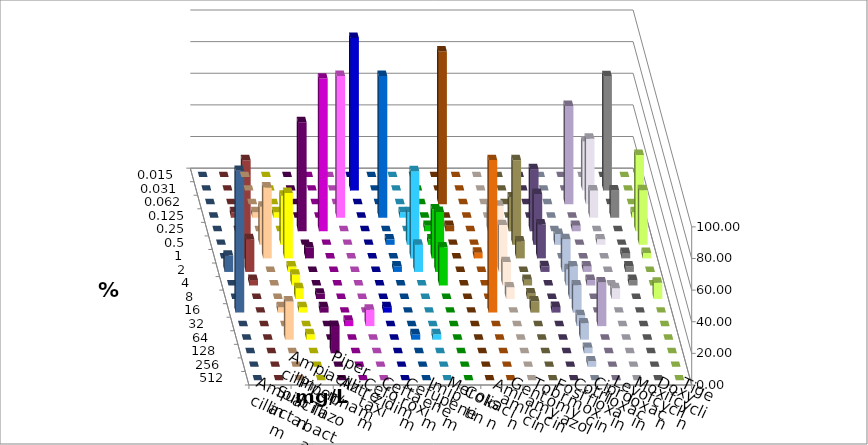
| Category | Ampicillin | Ampicillin/ Sulbactam | Piperacillin | Piperacillin/ Tazobactam | Aztreonam | Cefotaxim | Ceftazidim | Cefuroxim | Imipenem | Meropenem | Colistin | Amikacin | Gentamicin | Tobramycin | Fosfomycin | Cotrimoxazol | Ciprofloxacin | Levofloxacin | Moxifloxacin | Doxycyclin | Tigecyclin |
|---|---|---|---|---|---|---|---|---|---|---|---|---|---|---|---|---|---|---|---|---|---|
| 0.015 | 0 | 0 | 0 | 0 | 0 | 0 | 0 | 0 | 0 | 0 | 0 | 0 | 0 | 0 | 0 | 0 | 0 | 0 | 0 | 0 | 0 |
| 0.031 | 0 | 0 | 0 | 0 | 0 | 96.552 | 0 | 0 | 0 | 0 | 0 | 0 | 0 | 0 | 0 | 0 | 31.034 | 72.414 | 0 | 0 | 0 |
| 0.062 | 0 | 0 | 0 | 0 | 0 | 0 | 0 | 0 | 0 | 96.552 | 0 | 0 | 0 | 0 | 0 | 62.069 | 41.379 | 0 | 0 | 0 | 0 |
| 0.125 | 3.448 | 3.448 | 0 | 0 | 89.655 | 0 | 89.655 | 3.448 | 0 | 0 | 0 | 0 | 0 | 0 | 0 | 0 | 17.241 | 17.241 | 3.448 | 0 | 3.448 |
| 0.25 | 0 | 0 | 68.966 | 96.552 | 0 | 0 | 0 | 0 | 3.448 | 3.448 | 0 | 14.815 | 21.429 | 39.286 | 0 | 3.448 | 0 | 0 | 48.276 | 0 | 0 |
| 0.5 | 24.138 | 31.034 | 0 | 0 | 0 | 0 | 3.448 | 20.69 | 3.448 | 0 | 0 | 0 | 53.571 | 32.143 | 6.897 | 0 | 3.448 | 0 | 34.483 | 0 | 10.345 |
| 1.0 | 44.828 | 41.379 | 6.897 | 0 | 0 | 0 | 0 | 55.172 | 31.034 | 0 | 3.571 | 33.333 | 10.714 | 21.429 | 0 | 0 | 0 | 3.448 | 3.448 | 0 | 62.069 |
| 2.0 | 0 | 3.448 | 0 | 0 | 0 | 0 | 3.448 | 17.241 | 37.931 | 0 | 0 | 29.63 | 0 | 3.571 | 20.69 | 3.448 | 0 | 3.448 | 0 | 10.345 | 20.69 |
| 4.0 | 0 | 6.897 | 0 | 0 | 0 | 0 | 0 | 0 | 24.138 | 0 | 0 | 14.815 | 3.571 | 0 | 10.345 | 3.448 | 0 | 3.448 | 0 | 0 | 3.448 |
| 8.0 | 0 | 6.897 | 3.448 | 0 | 0 | 0 | 0 | 0 | 0 | 0 | 0 | 7.407 | 3.571 | 0 | 20.69 | 0 | 6.897 | 0 | 10.345 | 0 | 0 |
| 16.0 | 3.448 | 3.448 | 3.448 | 0 | 0 | 3.448 | 0 | 0 | 0 | 0 | 96.429 | 0 | 7.143 | 3.571 | 17.241 | 0 | 0 | 0 | 0 | 89.655 | 0 |
| 32.0 | 0 | 0 | 0 | 3.448 | 10.345 | 0 | 0 | 0 | 0 | 0 | 0 | 0 | 0 | 0 | 6.897 | 27.586 | 0 | 0 | 0 | 0 | 0 |
| 64.0 | 24.138 | 3.448 | 0 | 0 | 0 | 0 | 3.448 | 3.448 | 0 | 0 | 0 | 0 | 0 | 0 | 10.345 | 0 | 0 | 0 | 0 | 0 | 0 |
| 128.0 | 0 | 0 | 17.241 | 0 | 0 | 0 | 0 | 0 | 0 | 0 | 0 | 0 | 0 | 0 | 3.448 | 0 | 0 | 0 | 0 | 0 | 0 |
| 256.0 | 0 | 0 | 0 | 0 | 0 | 0 | 0 | 0 | 0 | 0 | 0 | 0 | 0 | 0 | 3.448 | 0 | 0 | 0 | 0 | 0 | 0 |
| 512.0 | 0 | 0 | 0 | 0 | 0 | 0 | 0 | 0 | 0 | 0 | 0 | 0 | 0 | 0 | 0 | 0 | 0 | 0 | 0 | 0 | 0 |